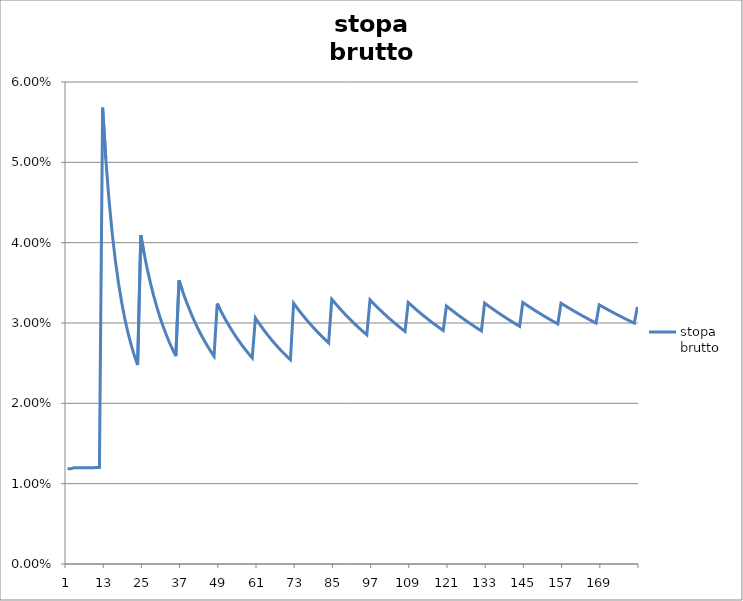
| Category | stopa_x000d_brutto |
|---|---|
| 0 | 0.012 |
| 1 | 0.012 |
| 2 | 0.012 |
| 3 | 0.012 |
| 4 | 0.012 |
| 5 | 0.012 |
| 6 | 0.012 |
| 7 | 0.012 |
| 8 | 0.012 |
| 9 | 0.012 |
| 10 | 0.012 |
| 11 | 0.057 |
| 12 | 0.05 |
| 13 | 0.045 |
| 14 | 0.041 |
| 15 | 0.038 |
| 16 | 0.035 |
| 17 | 0.033 |
| 18 | 0.031 |
| 19 | 0.029 |
| 20 | 0.027 |
| 21 | 0.026 |
| 22 | 0.025 |
| 23 | 0.041 |
| 24 | 0.039 |
| 25 | 0.037 |
| 26 | 0.035 |
| 27 | 0.033 |
| 28 | 0.032 |
| 29 | 0.031 |
| 30 | 0.03 |
| 31 | 0.029 |
| 32 | 0.028 |
| 33 | 0.027 |
| 34 | 0.026 |
| 35 | 0.035 |
| 36 | 0.034 |
| 37 | 0.033 |
| 38 | 0.032 |
| 39 | 0.031 |
| 40 | 0.03 |
| 41 | 0.029 |
| 42 | 0.028 |
| 43 | 0.028 |
| 44 | 0.027 |
| 45 | 0.026 |
| 46 | 0.026 |
| 47 | 0.032 |
| 48 | 0.032 |
| 49 | 0.031 |
| 50 | 0.03 |
| 51 | 0.029 |
| 52 | 0.029 |
| 53 | 0.028 |
| 54 | 0.028 |
| 55 | 0.027 |
| 56 | 0.027 |
| 57 | 0.026 |
| 58 | 0.026 |
| 59 | 0.031 |
| 60 | 0.03 |
| 61 | 0.029 |
| 62 | 0.029 |
| 63 | 0.028 |
| 64 | 0.028 |
| 65 | 0.027 |
| 66 | 0.027 |
| 67 | 0.027 |
| 68 | 0.026 |
| 69 | 0.026 |
| 70 | 0.025 |
| 71 | 0.032 |
| 72 | 0.032 |
| 73 | 0.031 |
| 74 | 0.031 |
| 75 | 0.03 |
| 76 | 0.03 |
| 77 | 0.03 |
| 78 | 0.029 |
| 79 | 0.029 |
| 80 | 0.028 |
| 81 | 0.028 |
| 82 | 0.028 |
| 83 | 0.033 |
| 84 | 0.032 |
| 85 | 0.032 |
| 86 | 0.032 |
| 87 | 0.031 |
| 88 | 0.031 |
| 89 | 0.03 |
| 90 | 0.03 |
| 91 | 0.03 |
| 92 | 0.029 |
| 93 | 0.029 |
| 94 | 0.029 |
| 95 | 0.033 |
| 96 | 0.032 |
| 97 | 0.032 |
| 98 | 0.032 |
| 99 | 0.031 |
| 100 | 0.031 |
| 101 | 0.031 |
| 102 | 0.03 |
| 103 | 0.03 |
| 104 | 0.03 |
| 105 | 0.029 |
| 106 | 0.029 |
| 107 | 0.033 |
| 108 | 0.032 |
| 109 | 0.032 |
| 110 | 0.032 |
| 111 | 0.031 |
| 112 | 0.031 |
| 113 | 0.031 |
| 114 | 0.03 |
| 115 | 0.03 |
| 116 | 0.03 |
| 117 | 0.029 |
| 118 | 0.029 |
| 119 | 0.032 |
| 120 | 0.032 |
| 121 | 0.031 |
| 122 | 0.031 |
| 123 | 0.031 |
| 124 | 0.031 |
| 125 | 0.03 |
| 126 | 0.03 |
| 127 | 0.03 |
| 128 | 0.03 |
| 129 | 0.029 |
| 130 | 0.029 |
| 131 | 0.032 |
| 132 | 0.032 |
| 133 | 0.032 |
| 134 | 0.032 |
| 135 | 0.031 |
| 136 | 0.031 |
| 137 | 0.031 |
| 138 | 0.031 |
| 139 | 0.03 |
| 140 | 0.03 |
| 141 | 0.03 |
| 142 | 0.03 |
| 143 | 0.033 |
| 144 | 0.032 |
| 145 | 0.032 |
| 146 | 0.032 |
| 147 | 0.032 |
| 148 | 0.031 |
| 149 | 0.031 |
| 150 | 0.031 |
| 151 | 0.031 |
| 152 | 0.03 |
| 153 | 0.03 |
| 154 | 0.03 |
| 155 | 0.032 |
| 156 | 0.032 |
| 157 | 0.032 |
| 158 | 0.032 |
| 159 | 0.032 |
| 160 | 0.031 |
| 161 | 0.031 |
| 162 | 0.031 |
| 163 | 0.031 |
| 164 | 0.03 |
| 165 | 0.03 |
| 166 | 0.03 |
| 167 | 0.032 |
| 168 | 0.032 |
| 169 | 0.032 |
| 170 | 0.032 |
| 171 | 0.031 |
| 172 | 0.031 |
| 173 | 0.031 |
| 174 | 0.031 |
| 175 | 0.031 |
| 176 | 0.03 |
| 177 | 0.03 |
| 178 | 0.03 |
| 179 | 0.032 |